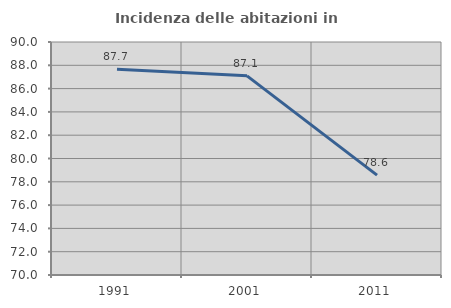
| Category | Incidenza delle abitazioni in proprietà  |
|---|---|
| 1991.0 | 87.671 |
| 2001.0 | 87.097 |
| 2011.0 | 78.571 |